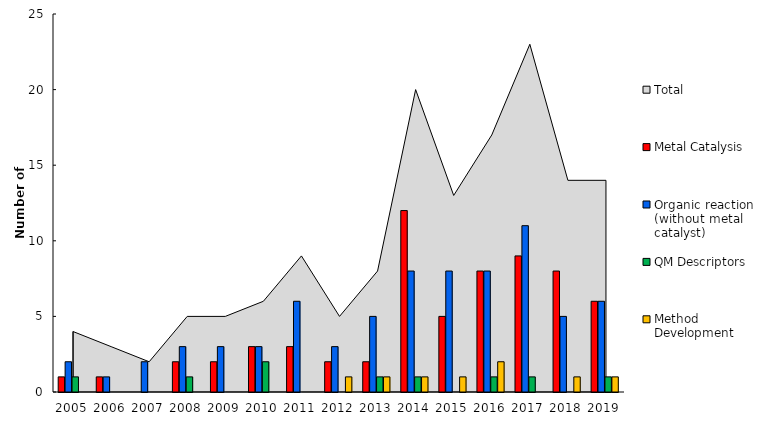
| Category | Metal Catalysis  | Organic reaction (without metal catalyst) | QM Descriptors | Method Development  |
|---|---|---|---|---|
| 2005.0 | 1 | 2 | 1 | 0 |
| 2006.0 | 1 | 1 | 0 | 0 |
| 2007.0 | 0 | 2 | 0 | 0 |
| 2008.0 | 2 | 3 | 1 | 0 |
| 2009.0 | 2 | 3 | 0 | 0 |
| 2010.0 | 3 | 3 | 2 | 0 |
| 2011.0 | 3 | 6 | 0 | 0 |
| 2012.0 | 2 | 3 | 0 | 1 |
| 2013.0 | 2 | 5 | 1 | 1 |
| 2014.0 | 12 | 8 | 1 | 1 |
| 2015.0 | 5 | 8 | 0 | 1 |
| 2016.0 | 8 | 8 | 1 | 2 |
| 2017.0 | 9 | 11 | 1 | 0 |
| 2018.0 | 8 | 5 | 0 | 1 |
| 2019.0 | 6 | 6 | 1 | 1 |